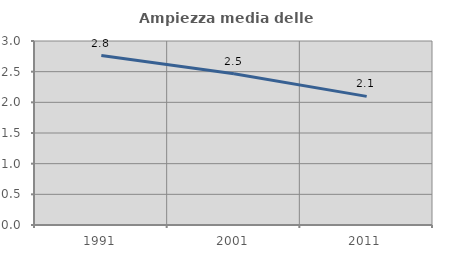
| Category | Ampiezza media delle famiglie |
|---|---|
| 1991.0 | 2.763 |
| 2001.0 | 2.466 |
| 2011.0 | 2.097 |